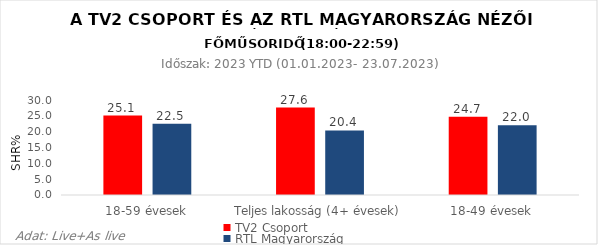
| Category | TV2 Csoport | RTL Magyarország |
|---|---|---|
| 18-59 évesek | 25.1 | 22.5 |
| Teljes lakosság (4+ évesek) | 27.6 | 20.4 |
| 18-49 évesek | 24.7 | 22 |